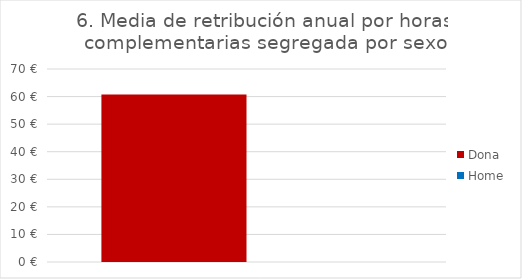
| Category | Dona | Home |
|---|---|---|
| Total | 60.714 | 0 |